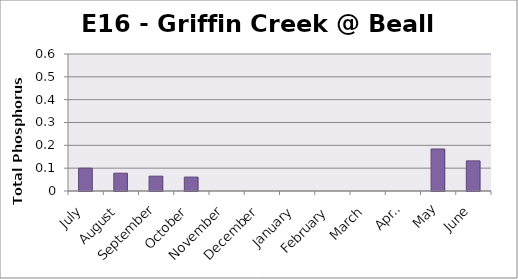
| Category | Phosphorus (mg/L) |
|---|---|
| July | 0.1 |
| August | 0.078 |
| September | 0.065 |
| October | 0.061 |
| November | 0 |
| December | 0 |
| January | 0 |
| February | 0 |
| March | 0 |
| April | 0 |
| May | 0.184 |
| June | 0.132 |